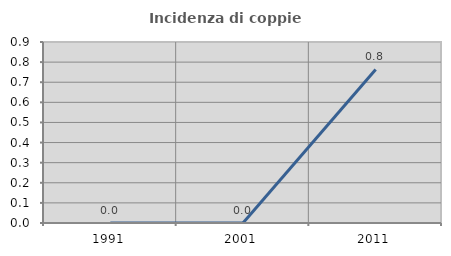
| Category | Incidenza di coppie miste |
|---|---|
| 1991.0 | 0 |
| 2001.0 | 0 |
| 2011.0 | 0.763 |